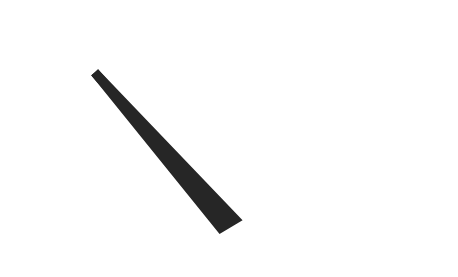
| Category | y |
|---|---|
| 20.775778997271075 | 40.57 |
| 51.6228098628163 | 1.169 |
| 48.3771901371837 | -1.169 |
| 20.775778997271075 | 40.57 |
| 50.0 | 0 |